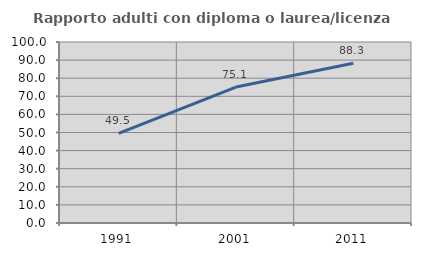
| Category | Rapporto adulti con diploma o laurea/licenza media  |
|---|---|
| 1991.0 | 49.493 |
| 2001.0 | 75.087 |
| 2011.0 | 88.256 |